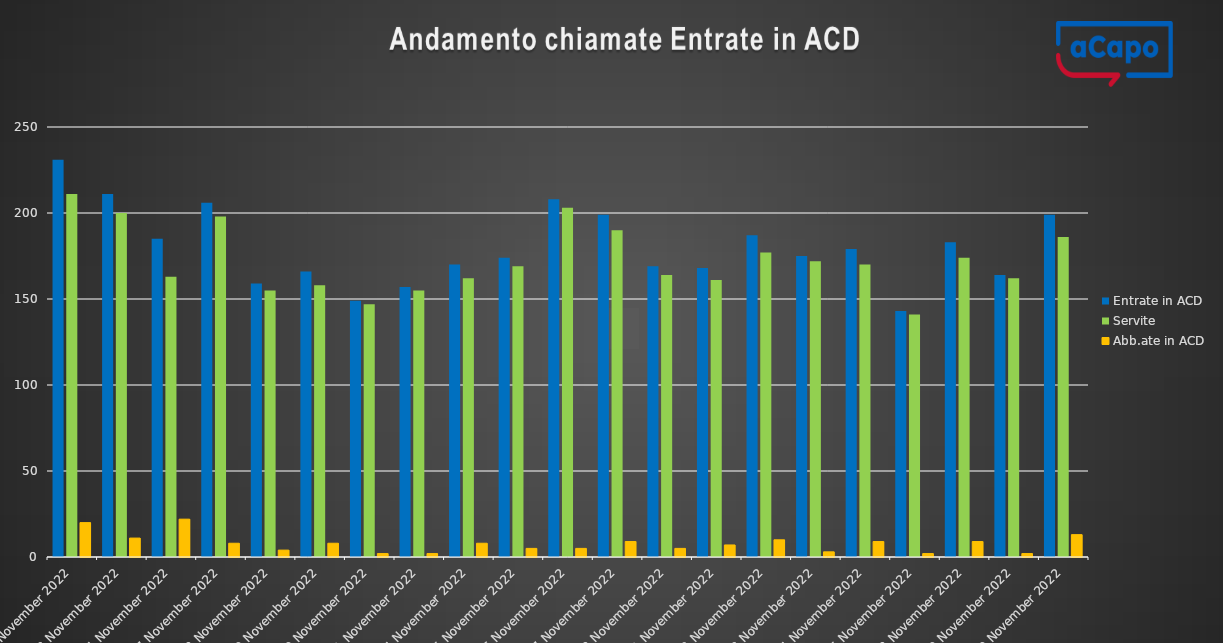
| Category | Entrate in ACD | Servite | Abb.ate in ACD |
|---|---|---|---|
| 2022-11-02 | 231 | 211 | 20 |
| 2022-11-03 | 211 | 200 | 11 |
| 2022-11-04 | 185 | 163 | 22 |
| 2022-11-07 | 206 | 198 | 8 |
| 2022-11-08 | 159 | 155 | 4 |
| 2022-11-09 | 166 | 158 | 8 |
| 2022-11-10 | 149 | 147 | 2 |
| 2022-11-11 | 157 | 155 | 2 |
| 2022-11-14 | 170 | 162 | 8 |
| 2022-11-15 | 174 | 169 | 5 |
| 2022-11-16 | 208 | 203 | 5 |
| 2022-11-17 | 199 | 190 | 9 |
| 2022-11-18 | 169 | 164 | 5 |
| 2022-11-21 | 168 | 161 | 7 |
| 2022-11-22 | 187 | 177 | 10 |
| 2022-11-23 | 175 | 172 | 3 |
| 2022-11-24 | 179 | 170 | 9 |
| 2022-11-25 | 143 | 141 | 2 |
| 2022-11-28 | 183 | 174 | 9 |
| 2022-11-29 | 164 | 162 | 2 |
| 2022-11-30 | 199 | 186 | 13 |